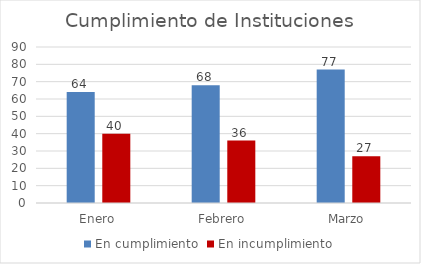
| Category | En cumplimiento | Series 1 | En incumplimiento |
|---|---|---|---|
| Enero | 64 |  | 40 |
| Febrero | 68 |  | 36 |
| Marzo | 77 |  | 27 |